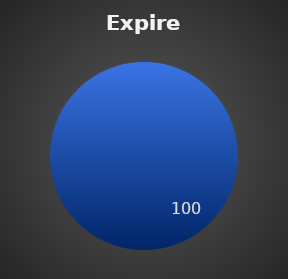
| Category | Expired |
|---|---|
| 0 | 100 |